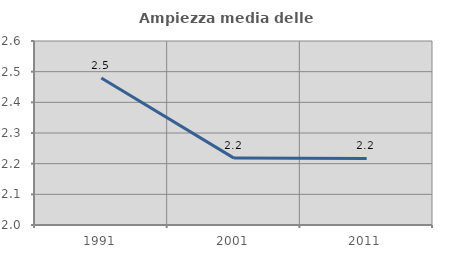
| Category | Ampiezza media delle famiglie |
|---|---|
| 1991.0 | 2.48 |
| 2001.0 | 2.218 |
| 2011.0 | 2.217 |